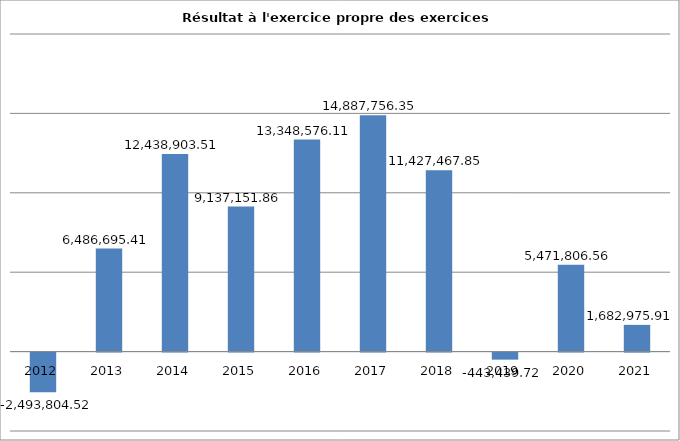
| Category | Series 0 |
|---|---|
| 2012.0 | -2493804.52 |
| 2013.0 | 6486695.41 |
| 2014.0 | 12438903.51 |
| 2015.0 | 9137151.86 |
| 2016.0 | 13348576.11 |
| 2017.0 | 14887756.35 |
| 2018.0 | 11427467.85 |
| 2019.0 | -443439.72 |
| 2020.0 | 5471806.56 |
| 2021.0 | 1682975.91 |